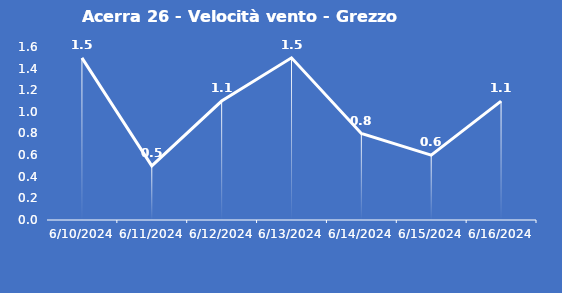
| Category | Acerra 26 - Velocità vento - Grezzo (m/s) |
|---|---|
| 6/10/24 | 1.5 |
| 6/11/24 | 0.5 |
| 6/12/24 | 1.1 |
| 6/13/24 | 1.5 |
| 6/14/24 | 0.8 |
| 6/15/24 | 0.6 |
| 6/16/24 | 1.1 |